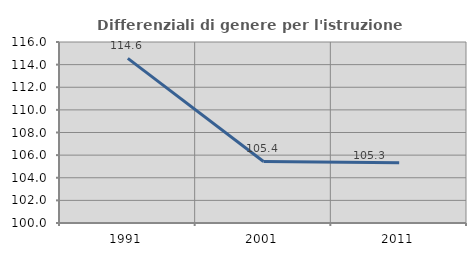
| Category | Differenziali di genere per l'istruzione superiore |
|---|---|
| 1991.0 | 114.554 |
| 2001.0 | 105.437 |
| 2011.0 | 105.318 |